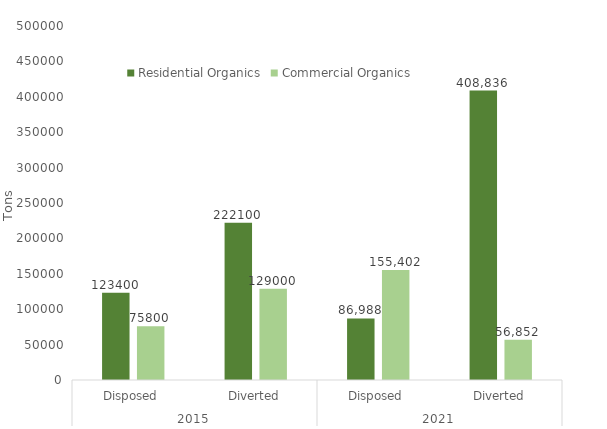
| Category | Residential Organics | Commercial Organics |
|---|---|---|
| 0 | 123400 | 75800 |
| 1 | 222100 | 129000 |
| 2 | 86988.136 | 155401.881 |
| 3 | 408836.13 | 56851.81 |